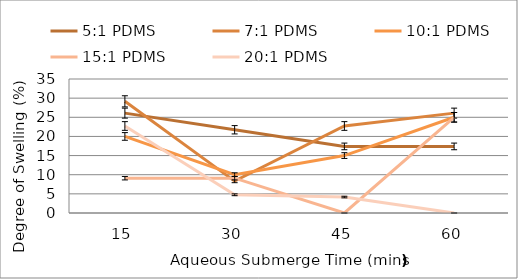
| Category | 5:1 PDMS | 7:1 PDMS | 10:1 PDMS | 15:1 PDMS | 20:1 PDMS |
|---|---|---|---|---|---|
| 0 | 26.087 | 29.167 | 20 | 9.091 | 22.727 |
| 1 | 21.739 | 8.333 | 10 | 9.091 | 4.762 |
| 2 | 17.391 | 22.727 | 15 | 0 | 4.167 |
| 3 | 17.391 | 26.087 | 25 | 25 | 0 |